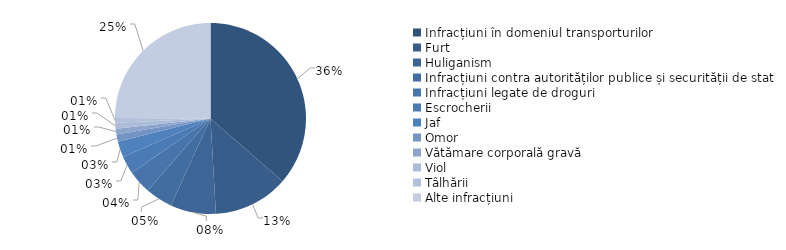
| Category | 2021 |
|---|---|
| Infracțiuni în domeniul transporturilor | 36.4 |
| Furt | 12.7 |
| Huliganism | 7.7 |
| Infracțiuni contra autorităților publice și securității de stat | 4.6 |
| Infracțiuni legate de droguri | 4 |
| Escrocherii | 3 |
| Jaf | 2.7 |
| Omor | 1.2 |
| Vătămare corporală gravă | 1 |
| Viol | 1 |
| Tâlhării | 0.8 |
| Alte infracțiuni | 24.9 |